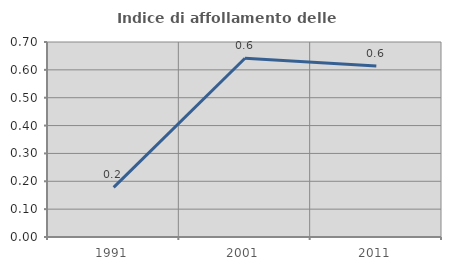
| Category | Indice di affollamento delle abitazioni  |
|---|---|
| 1991.0 | 0.178 |
| 2001.0 | 0.642 |
| 2011.0 | 0.613 |